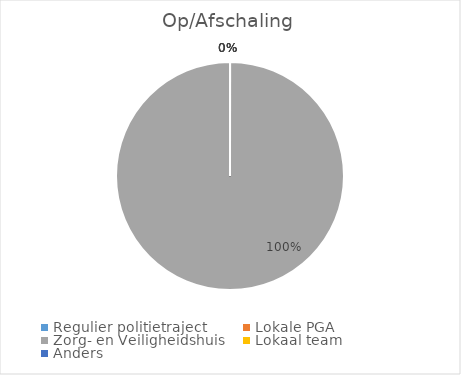
| Category | Series 0 |
|---|---|
| Regulier politietraject | 0 |
| Lokale PGA | 0 |
| Zorg- en Veiligheidshuis | 1 |
| Lokaal team | 0 |
| Anders | 0 |